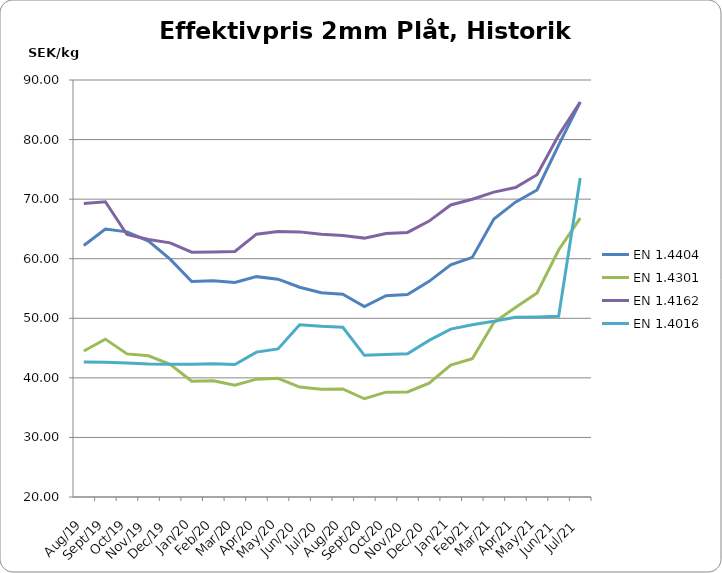
| Category | EN 1.4404 | EN 1.4301 | EN 1.4162  | EN 1.4016 |
|---|---|---|---|---|
| 2019-08-01 | 62.22 | 44.5 | 69.28 | 42.65 |
| 2019-09-01 | 64.97 | 46.5 | 69.57 | 42.62 |
| 2019-10-01 | 64.51 | 44.02 | 64.06 | 42.48 |
| 2019-11-01 | 62.95 | 43.71 | 63.23 | 42.31 |
| 2019-12-01 | 59.92 | 42.28 | 62.66 | 42.27 |
| 2020-01-01 | 56.17 | 39.44 | 61.09 | 42.3 |
| 2020-02-01 | 56.29 | 39.51 | 61.13 | 42.35 |
| 2020-03-01 | 56.011 | 38.762 | 61.207 | 42.238 |
| 2020-04-01 | 56.99 | 39.78 | 64.12 | 44.32 |
| 2020-05-01 | 56.561 | 39.922 | 64.555 | 44.865 |
| 2020-06-01 | 55.205 | 38.457 | 64.504 | 48.924 |
| 2020-07-01 | 54.28 | 38.09 | 64.1 | 48.67 |
| 2020-08-01 | 54.032 | 38.136 | 63.889 | 48.499 |
| 2020-09-01 | 51.982 | 36.492 | 63.459 | 43.787 |
| 2020-10-01 | 53.8 | 37.597 | 64.242 | 43.938 |
| 2020-11-01 | 53.982 | 37.627 | 64.412 | 44.061 |
| 2020-12-01 | 56.202 | 39.117 | 66.315 | 46.295 |
| 2021-01-01 | 58.983 | 42.129 | 69.024 | 48.184 |
| 2021-02-01 | 60.225 | 43.204 | 69.988 | 48.927 |
| 2021-03-01 | 66.669 | 49.29 | 71.179 | 49.506 |
| 2021-04-01 | 69.492 | 51.816 | 71.943 | 50.186 |
| 2021-05-01 | 71.536 | 54.26 | 74.099 | 50.223 |
| 2021-06-01 | 79.083 | 61.461 | 80.71 | 50.323 |
| 2021-07-01 | 86.292 | 66.826 | 86.308 | 73.542 |